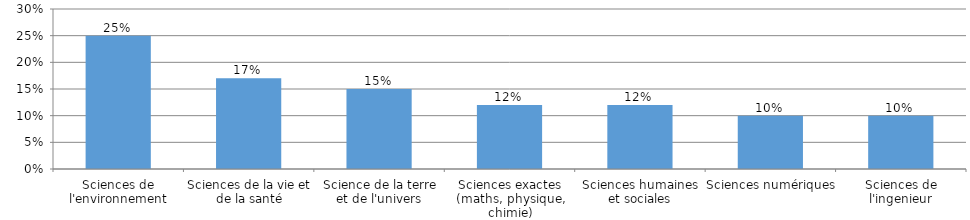
| Category | Sciences de l'environnement |
|---|---|
| Sciences de l'environnement | 0.25 |
| Sciences de la vie et de la santé | 0.17 |
| Science de la terre et de l'univers | 0.15 |
| Sciences exactes (maths, physique, chimie) | 0.12 |
| Sciences humaines et sociales | 0.12 |
| Sciences numériques | 0.1 |
| Sciences de l'ingenieur | 0.1 |